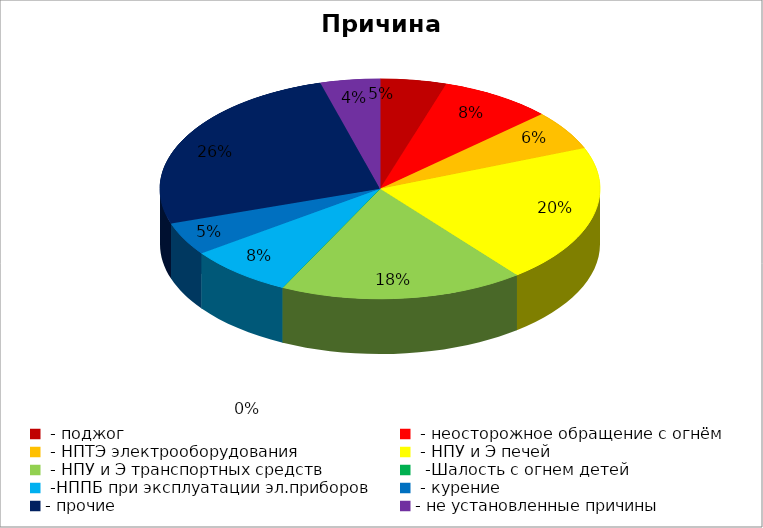
| Category | Причина пожара |
|---|---|
|  - поджог | 10 |
|  - неосторожное обращение с огнём | 17 |
|  - НПТЭ электрооборудования | 12 |
|  - НПУ и Э печей | 42 |
|  - НПУ и Э транспортных средств | 37 |
|   -Шалость с огнем детей | 0 |
|  -НППБ при эксплуатации эл.приборов | 16 |
|  - курение | 10 |
| - прочие | 53 |
| - не установленные причины | 9 |